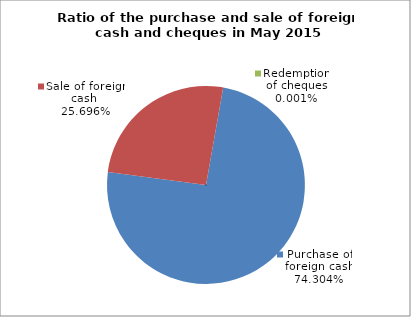
| Category | Purchase of foreign cash |
|---|---|
| 0 | 0.743 |
| 1 | 0.257 |
| 2 | 0 |